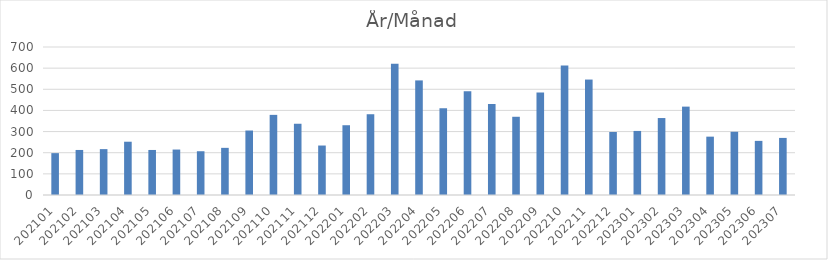
| Category | Summa |
|---|---|
| 202101 | 198 |
| 202102 | 213 |
| 202103 | 217 |
| 202104 | 252 |
| 202105 | 213 |
| 202106 | 215 |
| 202107 | 207 |
| 202108 | 223 |
| 202109 | 305 |
| 202110 | 379 |
| 202111 | 337 |
| 202112 | 234 |
| 202201 | 330 |
| 202202 | 382 |
| 202203 | 621 |
| 202204 | 542 |
| 202205 | 410 |
| 202206 | 491 |
| 202207 | 430 |
| 202208 | 370 |
| 202209 | 485 |
| 202210 | 612 |
| 202211 | 546 |
| 202212 | 298 |
| 202301 | 303 |
| 202302 | 364 |
| 202303 | 418 |
| 202304 | 276 |
| 202305 | 299 |
| 202306 | 256 |
| 202307 | 270 |